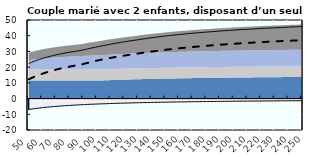
| Category | Coin fiscal moyen (somme des composantes) | Taux moyen d'imposition net en % du salaire brut |
|---|---|---|
| 50.0 | 22.318 | 12.219 |
| 51.0 | 22.694 | 12.644 |
| 52.0 | 23.056 | 13.053 |
| 53.0 | 23.404 | 13.446 |
| 54.0 | 23.739 | 13.825 |
| 55.0 | 24.062 | 14.19 |
| 56.0 | 24.374 | 14.542 |
| 57.0 | 24.674 | 14.882 |
| 58.0 | 24.964 | 15.21 |
| 59.0 | 25.245 | 15.526 |
| 60.0 | 25.516 | 15.833 |
| 61.0 | 25.778 | 16.129 |
| 62.0 | 26.031 | 16.416 |
| 63.0 | 26.277 | 16.693 |
| 64.0 | 26.515 | 16.962 |
| 65.0 | 26.746 | 17.222 |
| 66.0 | 26.969 | 17.475 |
| 67.0 | 27.186 | 17.72 |
| 68.0 | 27.397 | 17.958 |
| 69.0 | 27.601 | 18.189 |
| 70.0 | 27.8 | 18.414 |
| 71.0 | 27.993 | 18.632 |
| 72.0 | 28.18 | 18.844 |
| 73.0 | 28.363 | 19.05 |
| 74.0 | 28.541 | 19.251 |
| 75.0 | 28.713 | 19.446 |
| 76.0 | 28.882 | 19.636 |
| 77.0 | 29.046 | 19.822 |
| 78.0 | 29.205 | 20.002 |
| 79.0 | 29.361 | 20.178 |
| 80.0 | 29.513 | 20.35 |
| 81.0 | 29.661 | 20.517 |
| 82.0 | 29.805 | 20.68 |
| 83.0 | 29.946 | 20.839 |
| 84.0 | 30.084 | 20.995 |
| 85.0 | 30.218 | 21.147 |
| 86.0 | 30.349 | 21.295 |
| 87.0 | 30.478 | 21.44 |
| 88.0 | 30.603 | 21.581 |
| 89.0 | 30.786 | 21.789 |
| 90.0 | 30.999 | 22.029 |
| 91.0 | 31.207 | 22.264 |
| 92.0 | 31.41 | 22.493 |
| 93.0 | 31.609 | 22.718 |
| 94.0 | 31.804 | 22.938 |
| 95.0 | 31.994 | 23.153 |
| 96.0 | 32.181 | 23.364 |
| 97.0 | 32.364 | 23.571 |
| 98.0 | 32.543 | 23.773 |
| 99.0 | 32.718 | 23.972 |
| 100.0 | 32.89 | 24.166 |
| 101.0 | 33.059 | 24.356 |
| 102.0 | 33.224 | 24.543 |
| 103.0 | 33.386 | 24.726 |
| 104.0 | 33.571 | 24.906 |
| 105.0 | 33.755 | 25.082 |
| 106.0 | 33.934 | 25.255 |
| 107.0 | 34.111 | 25.424 |
| 108.0 | 34.284 | 25.591 |
| 109.0 | 34.453 | 25.754 |
| 110.0 | 34.62 | 25.914 |
| 111.0 | 34.783 | 26.072 |
| 112.0 | 34.943 | 26.227 |
| 113.0 | 35.101 | 26.379 |
| 114.0 | 35.255 | 26.528 |
| 115.0 | 35.407 | 26.675 |
| 116.0 | 35.556 | 26.819 |
| 117.0 | 35.702 | 26.961 |
| 118.0 | 35.846 | 27.1 |
| 119.0 | 35.987 | 27.237 |
| 120.0 | 36.126 | 27.372 |
| 121.0 | 36.262 | 27.504 |
| 122.0 | 36.396 | 27.634 |
| 123.0 | 36.528 | 27.762 |
| 124.0 | 36.658 | 27.889 |
| 125.0 | 36.785 | 28.013 |
| 126.0 | 36.911 | 28.135 |
| 127.0 | 37.034 | 28.255 |
| 128.0 | 37.168 | 28.388 |
| 129.0 | 37.308 | 28.528 |
| 130.0 | 37.445 | 28.665 |
| 131.0 | 37.581 | 28.801 |
| 132.0 | 37.714 | 28.934 |
| 133.0 | 37.845 | 29.065 |
| 134.0 | 37.974 | 29.195 |
| 135.0 | 38.101 | 29.322 |
| 136.0 | 38.226 | 29.448 |
| 137.0 | 38.35 | 29.571 |
| 138.0 | 38.471 | 29.693 |
| 139.0 | 38.591 | 29.814 |
| 140.0 | 38.708 | 29.932 |
| 141.0 | 38.825 | 30.049 |
| 142.0 | 38.939 | 30.164 |
| 143.0 | 39.052 | 30.278 |
| 144.0 | 39.163 | 30.39 |
| 145.0 | 39.273 | 30.5 |
| 146.0 | 39.381 | 30.609 |
| 147.0 | 39.487 | 30.716 |
| 148.0 | 39.592 | 30.822 |
| 149.0 | 39.696 | 30.927 |
| 150.0 | 39.798 | 31.03 |
| 151.0 | 39.899 | 31.132 |
| 152.0 | 39.998 | 31.232 |
| 153.0 | 40.096 | 31.331 |
| 154.0 | 40.193 | 31.429 |
| 155.0 | 40.289 | 31.526 |
| 156.0 | 40.383 | 31.621 |
| 157.0 | 40.476 | 31.715 |
| 158.0 | 40.568 | 31.808 |
| 159.0 | 40.658 | 31.9 |
| 160.0 | 40.748 | 31.991 |
| 161.0 | 40.836 | 32.08 |
| 162.0 | 40.923 | 32.168 |
| 163.0 | 41.009 | 32.256 |
| 164.0 | 41.094 | 32.342 |
| 165.0 | 41.178 | 32.427 |
| 166.0 | 41.261 | 32.511 |
| 167.0 | 41.343 | 32.595 |
| 168.0 | 41.424 | 32.677 |
| 169.0 | 41.504 | 32.758 |
| 170.0 | 41.582 | 32.838 |
| 171.0 | 41.66 | 32.917 |
| 172.0 | 41.737 | 32.996 |
| 173.0 | 41.814 | 33.073 |
| 174.0 | 41.889 | 33.15 |
| 175.0 | 41.963 | 33.226 |
| 176.0 | 42.037 | 33.301 |
| 177.0 | 42.109 | 33.375 |
| 178.0 | 42.181 | 33.448 |
| 179.0 | 42.252 | 33.52 |
| 180.0 | 42.322 | 33.592 |
| 181.0 | 42.392 | 33.662 |
| 182.0 | 42.46 | 33.732 |
| 183.0 | 42.528 | 33.802 |
| 184.0 | 42.595 | 33.87 |
| 185.0 | 42.661 | 33.938 |
| 186.0 | 42.727 | 34.005 |
| 187.0 | 42.792 | 34.071 |
| 188.0 | 42.856 | 34.137 |
| 189.0 | 42.92 | 34.202 |
| 190.0 | 42.982 | 34.266 |
| 191.0 | 43.045 | 34.329 |
| 192.0 | 43.106 | 34.392 |
| 193.0 | 43.167 | 34.454 |
| 194.0 | 43.227 | 34.516 |
| 195.0 | 43.287 | 34.577 |
| 196.0 | 43.345 | 34.637 |
| 197.0 | 43.404 | 34.697 |
| 198.0 | 43.461 | 34.756 |
| 199.0 | 43.519 | 34.815 |
| 200.0 | 43.575 | 34.872 |
| 201.0 | 43.631 | 34.93 |
| 202.0 | 43.686 | 34.987 |
| 203.0 | 43.741 | 35.043 |
| 204.0 | 43.795 | 35.098 |
| 205.0 | 43.849 | 35.154 |
| 206.0 | 43.902 | 35.208 |
| 207.0 | 43.955 | 35.262 |
| 208.0 | 44.007 | 35.316 |
| 209.0 | 44.059 | 35.369 |
| 210.0 | 44.11 | 35.421 |
| 211.0 | 44.161 | 35.473 |
| 212.0 | 44.211 | 35.525 |
| 213.0 | 44.261 | 35.576 |
| 214.0 | 44.31 | 35.627 |
| 215.0 | 44.358 | 35.677 |
| 216.0 | 44.407 | 35.726 |
| 217.0 | 44.455 | 35.776 |
| 218.0 | 44.502 | 35.824 |
| 219.0 | 44.549 | 35.873 |
| 220.0 | 44.595 | 35.92 |
| 221.0 | 44.641 | 35.968 |
| 222.0 | 44.687 | 36.015 |
| 223.0 | 44.732 | 36.061 |
| 224.0 | 44.777 | 36.108 |
| 225.0 | 44.822 | 36.153 |
| 226.0 | 44.866 | 36.199 |
| 227.0 | 44.909 | 36.244 |
| 228.0 | 44.952 | 36.288 |
| 229.0 | 44.995 | 36.332 |
| 230.0 | 45.038 | 36.376 |
| 231.0 | 45.08 | 36.419 |
| 232.0 | 45.122 | 36.462 |
| 233.0 | 45.163 | 36.505 |
| 234.0 | 45.204 | 36.547 |
| 235.0 | 45.245 | 36.589 |
| 236.0 | 45.285 | 36.631 |
| 237.0 | 45.325 | 36.672 |
| 238.0 | 45.364 | 36.713 |
| 239.0 | 45.404 | 36.754 |
| 240.0 | 45.443 | 36.794 |
| 241.0 | 45.481 | 36.834 |
| 242.0 | 45.519 | 36.873 |
| 243.0 | 45.557 | 36.912 |
| 244.0 | 45.595 | 36.951 |
| 245.0 | 45.632 | 36.99 |
| 246.0 | 45.669 | 37.028 |
| 247.0 | 45.706 | 37.066 |
| 248.0 | 45.742 | 37.104 |
| 249.0 | 45.779 | 37.141 |
| 250.0 | 45.814 | 37.178 |